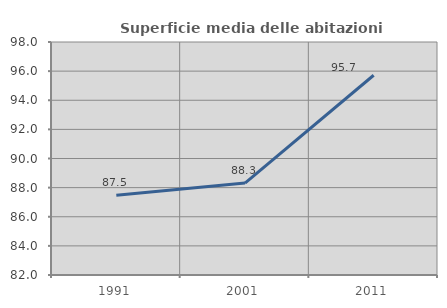
| Category | Superficie media delle abitazioni occupate |
|---|---|
| 1991.0 | 87.471 |
| 2001.0 | 88.311 |
| 2011.0 | 95.717 |